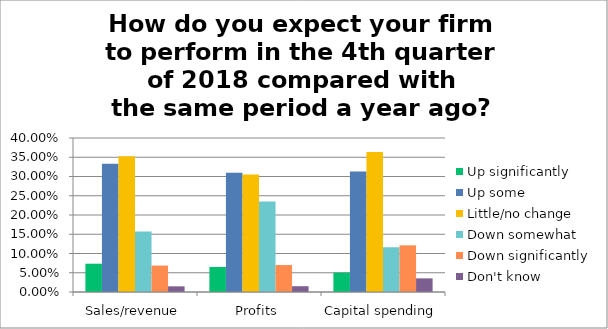
| Category | Up significantly | Up some | Little/no change | Down somewhat | Down significantly | Don't know |
|---|---|---|---|---|---|---|
| Sales/revenue | 0.074 | 0.333 | 0.353 | 0.157 | 0.069 | 0.015 |
| Profits | 0.065 | 0.31 | 0.305 | 0.235 | 0.07 | 0.015 |
| Capital spending | 0.05 | 0.313 | 0.364 | 0.116 | 0.121 | 0.035 |